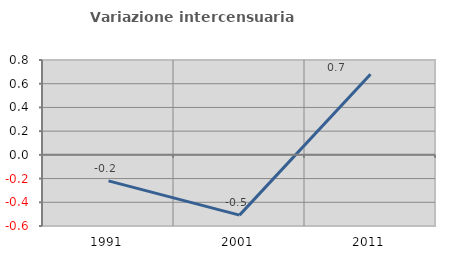
| Category | Variazione intercensuaria annua |
|---|---|
| 1991.0 | -0.219 |
| 2001.0 | -0.508 |
| 2011.0 | 0.68 |